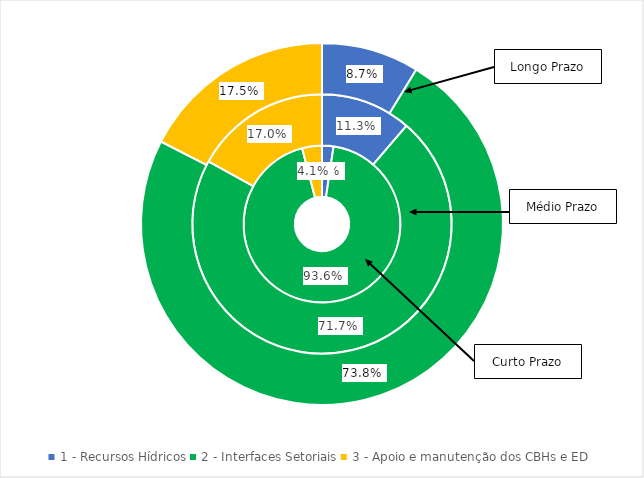
| Category | Curto Prazo (%) | Médio Prazo (%) | Longo Prazo (%) |
|---|---|---|---|
| 1 - Recursos Hídricos | 0.024 | 0.113 | 0.087 |
| 2 - Interfaces Setoriais | 0.936 | 0.717 | 0.738 |
| 3 - Apoio e manutenção dos CBHs e ED | 0.041 | 0.17 | 0.175 |